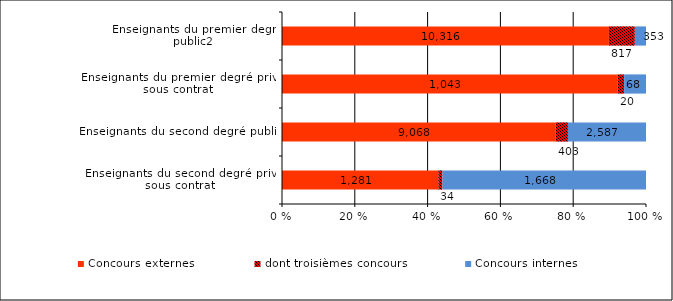
| Category | Concours externes | dont troisièmes concours | Concours internes |
|---|---|---|---|
| Enseignants du second degré privé sous contrat  | 1281 | 34 | 1668 |
| Enseignants du second degré public   | 9068 | 403 | 2587 |
| Enseignants du premier degré privé sous contrat  | 1043 | 20 | 68 |
| Enseignants du premier degré public2 | 10316 | 817 | 353 |